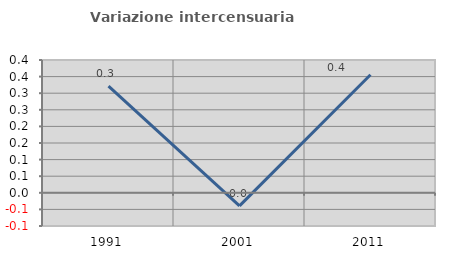
| Category | Variazione intercensuaria annua |
|---|---|
| 1991.0 | 0.321 |
| 2001.0 | -0.039 |
| 2011.0 | 0.356 |